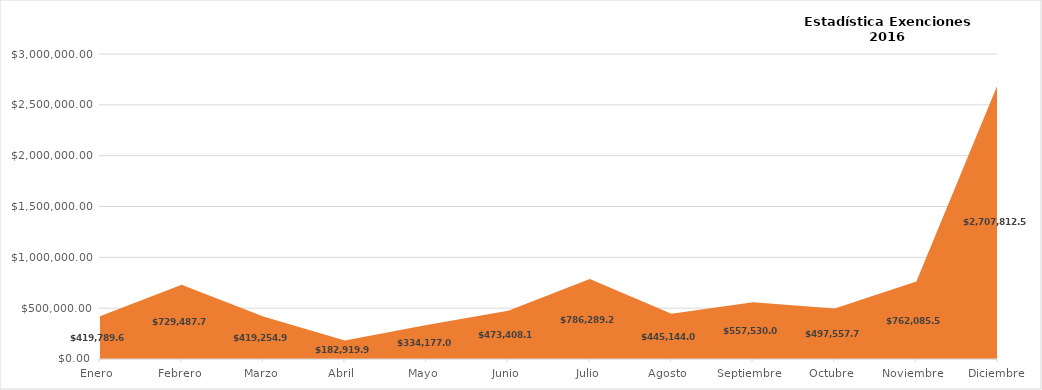
| Category | Series 0 |
|---|---|
| Enero  | 419789.61 |
| Febrero | 729487.72 |
| Marzo | 419254.97 |
| Abril  | 182919.9 |
| Mayo  | 334177.06 |
| Junio | 473408.17 |
| Julio | 786289.27 |
| Agosto  | 445144.03 |
| Septiembre  | 557530.05 |
| Octubre  | 497557.76 |
| Noviembre  | 762085.51 |
| Diciembre | 2707812.53 |